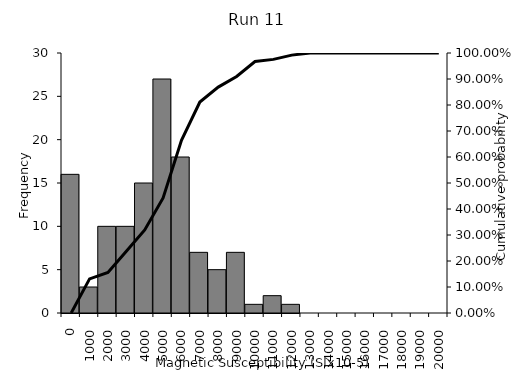
| Category | Series 1 |
|---|---|
| 0.0 | 16 |
| 1000.0 | 3 |
| 2000.0 | 10 |
| 3000.0 | 10 |
| 4000.0 | 15 |
| 5000.0 | 27 |
| 6000.0 | 18 |
| 7000.0 | 7 |
| 8000.0 | 5 |
| 9000.0 | 7 |
| 10000.0 | 1 |
| 11000.0 | 2 |
| 12000.0 | 1 |
| 13000.0 | 0 |
| 14000.0 | 0 |
| 15000.0 | 0 |
| 16000.0 | 0 |
| 17000.0 | 0 |
| 18000.0 | 0 |
| 19000.0 | 0 |
| 20000.0 | 0 |